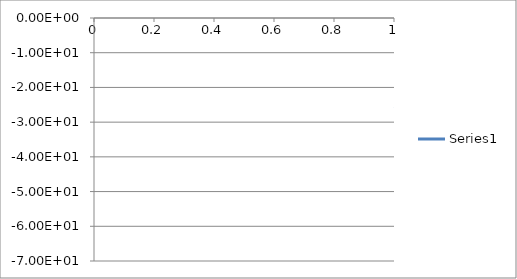
| Category | Series 0 |
|---|---|
| 0 | -26.165 |
| 1 | -20.684 |
| 2 | -17.987 |
| 3 | -16.5 |
| 4 | -15.622 |
| 5 | -14.998 |
| 6 | -14.456 |
| 7 | -13.958 |
| 8 | -13.532 |
| 9 | -13.148 |
| 10 | -12.762 |
| 11 | -12.366 |
| 12 | -12.04 |
| 13 | -11.885 |
| 14 | -11.953 |
| 15 | -12.172 |
| 16 | -12.353 |
| 17 | -12.293 |
| 18 | -12.002 |
| 19 | -11.69 |
| 20 | -11.552 |
| 21 | -11.625 |
| 22 | -11.781 |
| 23 | -11.832 |
| 24 | -11.701 |
| 25 | -11.538 |
| 26 | -11.54 |
| 27 | -11.799 |
| 28 | -12.169 |
| 29 | -12.324 |
| 30 | -12.008 |
| 31 | -11.369 |
| 32 | -10.741 |
| 33 | -10.342 |
| 34 | -10.191 |
| 35 | -10.226 |
| 36 | -10.385 |
| 37 | -10.676 |
| 38 | -11.179 |
| 39 | -11.923 |
| 40 | -12.706 |
| 41 | -13.01 |
| 42 | -12.489 |
| 43 | -11.548 |
| 44 | -10.772 |
| 45 | -10.422 |
| 46 | -10.445 |
| 47 | -10.561 |
| 48 | -10.415 |
| 49 | -9.92 |
| 50 | -9.392 |
| 51 | -9.215 |
| 52 | -9.654 |
| 53 | -10.905 |
| 54 | -13.173 |
| 55 | -16.634 |
| 56 | -20.153 |
| 57 | -19.436 |
| 58 | -16.992 |
| 59 | -15.536 |
| 60 | -14.969 |
| 61 | -14.822 |
| 62 | -14.636 |
| 63 | -14.24 |
| 64 | -13.805 |
| 65 | -13.567 |
| 66 | -13.594 |
| 67 | -13.776 |
| 68 | -13.904 |
| 69 | -13.852 |
| 70 | -13.701 |
| 71 | -13.635 |
| 72 | -13.748 |
| 73 | -13.982 |
| 74 | -14.128 |
| 75 | -14 |
| 76 | -13.615 |
| 77 | -13.178 |
| 78 | -12.879 |
| 79 | -12.806 |
| 80 | -12.961 |
| 81 | -13.294 |
| 82 | -13.76 |
| 83 | -14.335 |
| 84 | -15.029 |
| 85 | -15.814 |
| 86 | -16.59 |
| 87 | -17.147 |
| 88 | -17.315 |
| 89 | -17.122 |
| 90 | -16.792 |
| 91 | -16.511 |
| 92 | -16.368 |
| 93 | -16.339 |
| 94 | -16.366 |
| 95 | -16.405 |
| 96 | -16.447 |
| 97 | -16.51 |
| 98 | -16.604 |
| 99 | -16.716 |
| 100 | -16.805 |
| 101 | -16.85 |
| 102 | -16.843 |
| 103 | -16.82 |
| 104 | -16.804 |
| 105 | -16.816 |
| 106 | -16.841 |
| 107 | -16.861 |
| 108 | -16.85 |
| 109 | -16.783 |
| 110 | -16.613 |
| 111 | -16.317 |
| 112 | -15.899 |
| 113 | -15.42 |
| 114 | -14.964 |
| 115 | -14.605 |
| 116 | -14.397 |
| 117 | -14.34 |
| 118 | -14.42 |
| 119 | -14.606 |
| 120 | -14.886 |
| 121 | -15.259 |
| 122 | -15.748 |
| 123 | -16.354 |
| 124 | -17.057 |
| 125 | -17.786 |
| 126 | -18.476 |
| 127 | -19.093 |
| 128 | -19.691 |
| 129 | -20.314 |
| 130 | -20.962 |
| 131 | -21.518 |
| 132 | -21.876 |
| 133 | -22.078 |
| 134 | -22.308 |
| 135 | -22.748 |
| 136 | -23.401 |
| 137 | -23.996 |
| 138 | -24.142 |
| 139 | -23.797 |
| 140 | -23.402 |
| 141 | -23.425 |
| 142 | -24.158 |
| 143 | -25.833 |
| 144 | -28.741 |
| 145 | -33.308 |
| 146 | -38.295 |
| 147 | -36.963 |
| 148 | -35.012 |
| 149 | -35.244 |
| 150 | -37.889 |
| 151 | -44.52 |
| 152 | -59.762 |
| 153 | -44.215 |
| 154 | -41.217 |
| 155 | -40.172 |
| 156 | -37.924 |
| 157 | -34.658 |
| 158 | -31.938 |
| 159 | -30.112 |
| 160 | -28.953 |
| 161 | -28.104 |
| 162 | -27.166 |
| 163 | -25.99 |
| 164 | -24.751 |
| 165 | -23.683 |
| 166 | -22.969 |
| 167 | -22.658 |
| 168 | -22.805 |
| 169 | -23.418 |
| 170 | -24.526 |
| 171 | -25.958 |
| 172 | -27.017 |
| 173 | -26.503 |
| 174 | -24.766 |
| 175 | -22.992 |
| 176 | -21.765 |
| 177 | -21.146 |
| 178 | -21.122 |
| 179 | -21.607 |
| 180 | -22.47 |
| 181 | -23.473 |
| 182 | -24.299 |
| 183 | -24.82 |
| 184 | -25.15 |
| 185 | -25.547 |
| 186 | -26.047 |
| 187 | -26.576 |
| 188 | -26.921 |
| 189 | -27.092 |
| 190 | -27.201 |
| 191 | -27.472 |
| 192 | -27.913 |
| 193 | -28.552 |
| 194 | -29.232 |
| 195 | -30.025 |
| 196 | -30.975 |
| 197 | -32.226 |
| 198 | -33.428 |
| 199 | -33.781 |
| 200 | -32.801 |
| 201 | -31.377 |
| 202 | -30.117 |
| 203 | -29.257 |
| 204 | -28.664 |
| 205 | -28.325 |
| 206 | -28.189 |
| 207 | -28.276 |
| 208 | -28.586 |
| 209 | -28.99 |
| 210 | -29.238 |
| 211 | -29.168 |
| 212 | -28.883 |
| 213 | -28.698 |
| 214 | -28.883 |
| 215 | -29.497 |
| 216 | -30.485 |
| 217 | -31.453 |
| 218 | -32.018 |
| 219 | -32.072 |
| 220 | -32.092 |
| 221 | -32.34 |
| 222 | -32.855 |
| 223 | -33.254 |
| 224 | -33.27 |
| 225 | -32.873 |
| 226 | -32.518 |
| 227 | -32.324 |
| 228 | -32.31 |
| 229 | -32.201 |
| 230 | -31.933 |
| 231 | -31.545 |
| 232 | -31.288 |
| 233 | -31.203 |
| 234 | -31.241 |
| 235 | -31.207 |
| 236 | -31.123 |
| 237 | -30.987 |
| 238 | -30.939 |
| 239 | -30.978 |
| 240 | -31.003 |
| 241 | -30.838 |
| 242 | -30.462 |
| 243 | -30.023 |
| 244 | -29.734 |
| 245 | -29.626 |
| 246 | -29.563 |
| 247 | -29.388 |
| 248 | -29.005 |
| 249 | -28.516 |
| 250 | -28.058 |
| 251 | -27.775 |
| 252 | -27.594 |
| 253 | -27.431 |
| 254 | -27.151 |
| 255 | -26.765 |
| 256 | -26.349 |
| 257 | -26.002 |
| 258 | -25.701 |
| 259 | -25.444 |
| 260 | -25.182 |
| 261 | -24.885 |
| 262 | -24.587 |
| 263 | -24.323 |
| 264 | -24.102 |
| 265 | -23.908 |
| 266 | -23.752 |
| 267 | -23.629 |
| 268 | -23.566 |
| 269 | -23.578 |
| 270 | -23.661 |
| 271 | -23.748 |
| 272 | -23.82 |
| 273 | -23.836 |
| 274 | -23.898 |
| 275 | -24.037 |
| 276 | -24.308 |
| 277 | -24.64 |
| 278 | -24.932 |
| 279 | -25.06 |
| 280 | -25.024 |
| 281 | -24.924 |
| 282 | -24.912 |
| 283 | -25.036 |
| 284 | -25.303 |
| 285 | -25.652 |
| 286 | -25.989 |
| 287 | -26.323 |
| 288 | -26.576 |
| 289 | -26.766 |
| 290 | -26.768 |
| 291 | -26.609 |
| 292 | -26.317 |
| 293 | -26.109 |
| 294 | -26.076 |
| 295 | -26.29 |
| 296 | -26.64 |
| 297 | -27.063 |
| 298 | -27.359 |
| 299 | -27.548 |
| 300 | -27.587 |
| 301 | -27.669 |
| 302 | -27.726 |
| 303 | -27.803 |
| 304 | -27.836 |
| 305 | -27.958 |
| 306 | -28.126 |
| 307 | -28.473 |
| 308 | -28.768 |
| 309 | -28.959 |
| 310 | -28.936 |
| 311 | -28.799 |
| 312 | -28.683 |
| 313 | -28.755 |
| 314 | -28.944 |
| 315 | -29.226 |
| 316 | -29.363 |
| 317 | -29.388 |
| 318 | -29.346 |
| 319 | -29.357 |
| 320 | -29.505 |
| 321 | -29.684 |
| 322 | -29.784 |
| 323 | -29.728 |
| 324 | -29.475 |
| 325 | -29.219 |
| 326 | -29.079 |
| 327 | -29.174 |
| 328 | -29.427 |
| 329 | -29.675 |
| 330 | -29.706 |
| 331 | -29.391 |
| 332 | -28.997 |
| 333 | -28.733 |
| 334 | -28.757 |
| 335 | -29.058 |
| 336 | -29.396 |
| 337 | -29.543 |
| 338 | -29.383 |
| 339 | -29.066 |
| 340 | -28.929 |
| 341 | -29.02 |
| 342 | -29.245 |
| 343 | -29.33 |
| 344 | -29.15 |
| 345 | -28.889 |
| 346 | -28.838 |
| 347 | -29.188 |
| 348 | -30.007 |
| 349 | -31.043 |
| 350 | -32.018 |
| 351 | -32.637 |
| 352 | -33.271 |
| 353 | -34.146 |
| 354 | -35.557 |
| 355 | -36.818 |
| 356 | -36.916 |
| 357 | -36.043 |
| 358 | -35.818 |
| 359 | -36.381 |
| 360 | -37.625 |
| 361 | -37.441 |
| 362 | -35.754 |
| 363 | -34.072 |
| 364 | -33.312 |
| 365 | -33.385 |
| 366 | -34.15 |
| 367 | -34.299 |
| 368 | -33.738 |
| 369 | -32.807 |
| 370 | -32.549 |
| 371 | -32.756 |
| 372 | -33.226 |
| 373 | -33.09 |
| 374 | -32.654 |
| 375 | -32.23 |
| 376 | -32.557 |
| 377 | -32.906 |
| 378 | -32.775 |
| 379 | -31.701 |
| 380 | -30.671 |
| 381 | -30.33 |
| 382 | -30.914 |
| 383 | -31.711 |
| 384 | -31.548 |
| 385 | -30.056 |
| 386 | -28.91 |
| 387 | -28.72 |
| 388 | -29.859 |
| 389 | -31.51 |
| 390 | -30.684 |
| 391 | -28.129 |
| 392 | -26.754 |
| 393 | -26.652 |
| 394 | -27.31 |
| 395 | -25.648 |
| 396 | -21.32 |
| 397 | -16.97 |
| 398 | -13.228 |
| 399 | -9.853 |
| 400 | -6.582 |